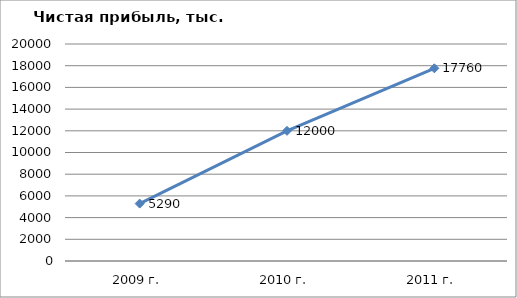
| Category | Series 0 |
|---|---|
| 2009 г. | 5290 |
| 2010 г. | 12000 |
| 2011 г. | 17760 |